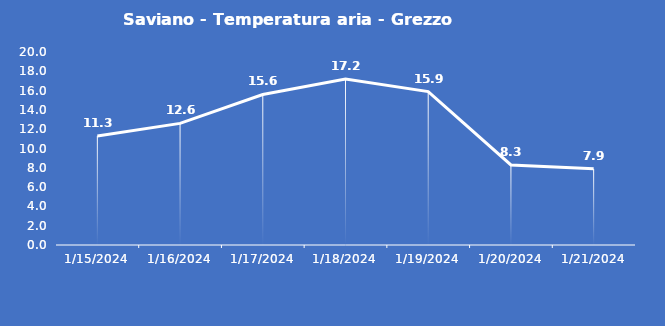
| Category | Saviano - Temperatura aria - Grezzo (°C) |
|---|---|
| 1/15/24 | 11.3 |
| 1/16/24 | 12.6 |
| 1/17/24 | 15.6 |
| 1/18/24 | 17.2 |
| 1/19/24 | 15.9 |
| 1/20/24 | 8.3 |
| 1/21/24 | 7.9 |